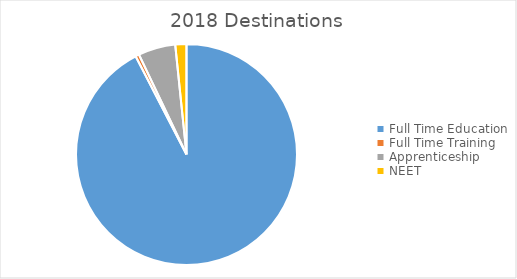
| Category | Series 0 |
|---|---|
| Full Time Education | 170 |
| Full Time Training | 1 |
| Apprenticeship | 10 |
| NEET | 3 |